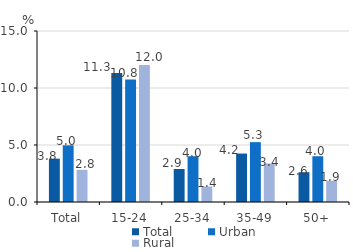
| Category | Total | Urban | Rural |
|---|---|---|---|
| Total | 3.802 | 4.974 | 2.823 |
| 15-24 | 11.306 | 10.751 | 12.014 |
| 25-34 | 2.894 | 4.015 | 1.361 |
| 35-49 | 4.249 | 5.251 | 3.376 |
| 50+ | 2.616 | 4.016 | 1.863 |